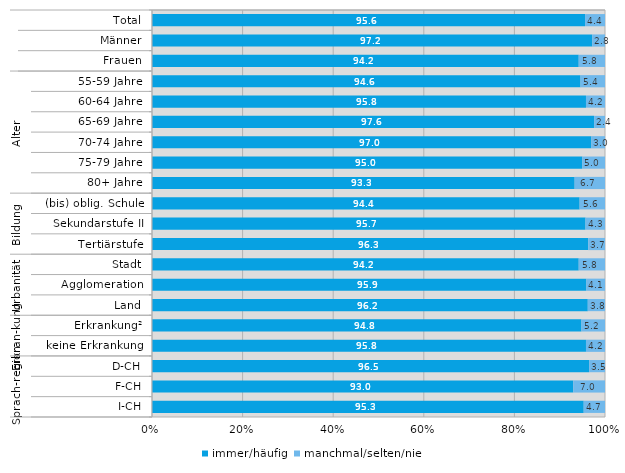
| Category | immer/häufig | manchmal/selten/nie |
|---|---|---|
| 0 | 95.6 | 4.4 |
| 1 | 97.2 | 2.8 |
| 2 | 94.2 | 5.8 |
| 3 | 94.6 | 5.4 |
| 4 | 95.8 | 4.2 |
| 5 | 97.6 | 2.4 |
| 6 | 97 | 3 |
| 7 | 95 | 5 |
| 8 | 93.3 | 6.7 |
| 9 | 94.4 | 5.6 |
| 10 | 95.7 | 4.3 |
| 11 | 96.3 | 3.7 |
| 12 | 94.2 | 5.8 |
| 13 | 95.9 | 4.1 |
| 14 | 96.2 | 3.8 |
| 15 | 94.8 | 5.2 |
| 16 | 95.8 | 4.2 |
| 17 | 96.5 | 3.5 |
| 18 | 93 | 7 |
| 19 | 95.3 | 4.7 |